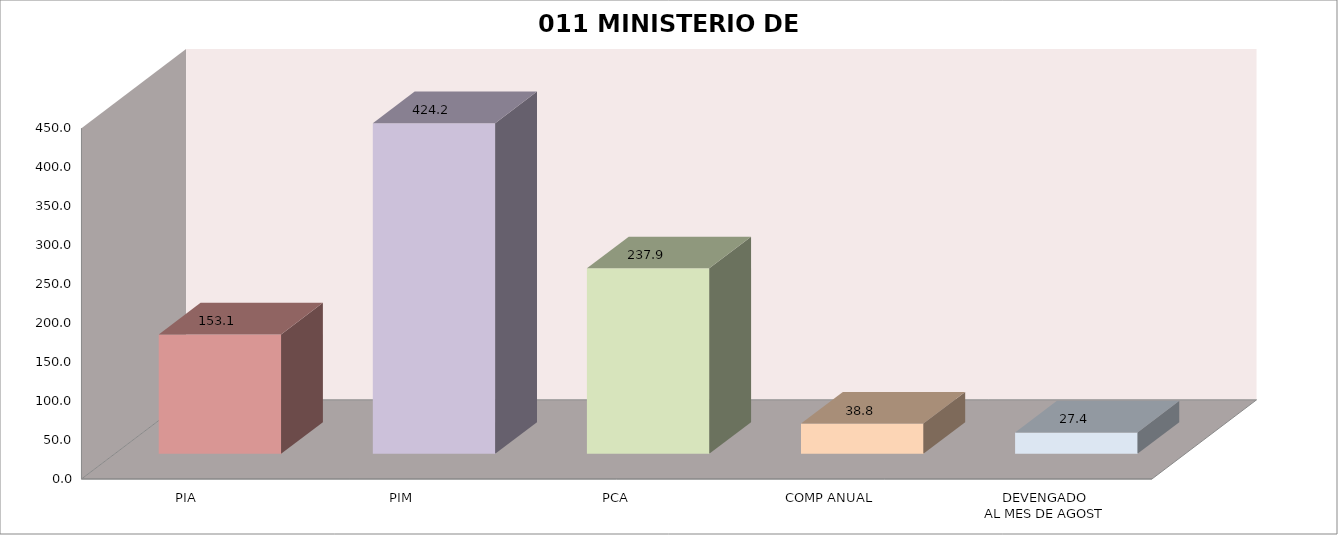
| Category | 011 MINISTERIO DE SALUD |
|---|---|
| PIA | 153.071 |
| PIM | 424.168 |
| PCA | 237.896 |
| COMP ANUAL | 38.758 |
| DEVENGADO
AL MES DE AGOST | 27.365 |